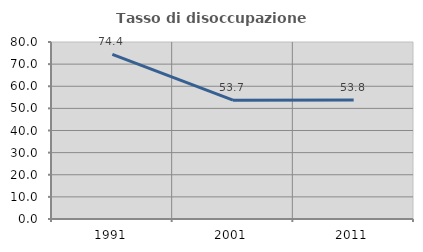
| Category | Tasso di disoccupazione giovanile  |
|---|---|
| 1991.0 | 74.442 |
| 2001.0 | 53.691 |
| 2011.0 | 53.782 |